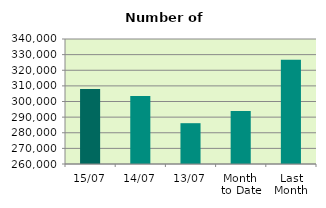
| Category | Series 0 |
|---|---|
| 15/07 | 307958 |
| 14/07 | 303578 |
| 13/07 | 286118 |
| Month 
to Date | 293842.909 |
| Last
Month | 326674.818 |